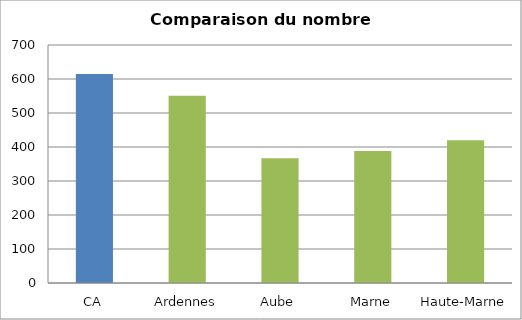
| Category | Series 0 |
|---|---|
| CA | 615 |
| Ardennes | 551 |
| Aube | 367 |
| Marne | 388 |
| Haute-Marne | 420 |